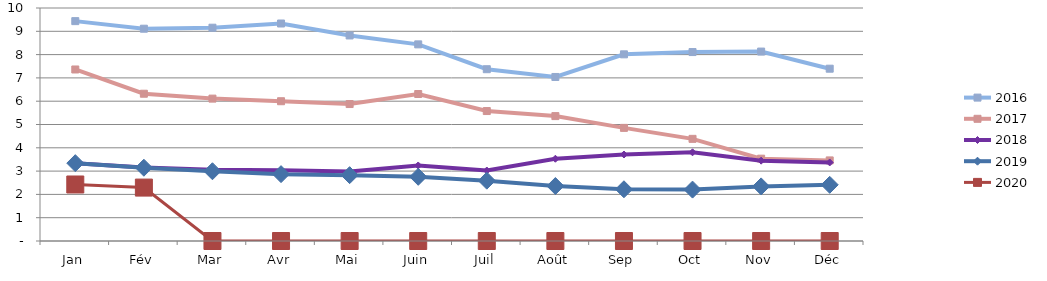
| Category | 2015 | 2016 | 2017 | 2018 | 2019 | 2020 |
|---|---|---|---|---|---|---|
| Jan |  | 9.436 | 7.361 | 3.34 | 3.341 | 2.425 |
| Fév |  | 9.111 | 6.321 | 3.159 | 3.145 | 2.293 |
| Mar |  | 9.154 | 6.111 | 3.062 | 2.994 | 0 |
| Avr |  | 9.335 | 5.999 | 3.031 | 2.87 | 0 |
| Mai |  | 8.821 | 5.878 | 2.984 | 2.827 | 0 |
| Juin |  | 8.439 | 6.309 | 3.242 | 2.755 | 0 |
| Juil |  | 7.373 | 5.577 | 3.025 | 2.589 | 0 |
| Août |  | 7.04 | 5.36 | 3.53 | 2.359 | 0 |
| Sep |  | 8.012 | 4.855 | 3.712 | 2.22 | 0 |
| Oct |  | 8.109 | 4.384 | 3.806 | 2.206 | 0 |
| Nov |  | 8.13 | 3.533 | 3.449 | 2.343 | 0 |
| Déc |  | 7.395 | 3.458 | 3.371 | 2.411 | 0 |